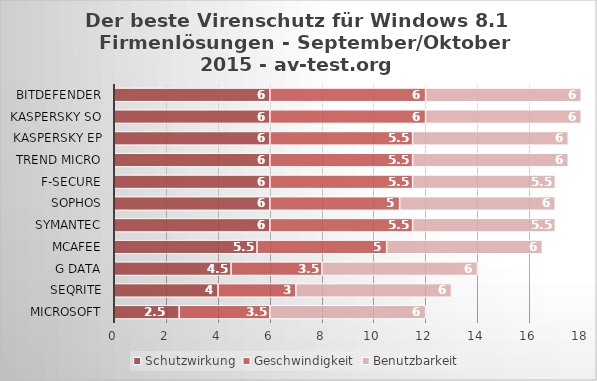
| Category | Schutzwirkung | Geschwindigkeit | Benutzbarkeit |
|---|---|---|---|
| Microsoft | 2.5 | 3.5 | 6 |
| Seqrite | 4 | 3 | 6 |
| G Data | 4.5 | 3.5 | 6 |
| McAfee | 5.5 | 5 | 6 |
| Symantec | 6 | 5.5 | 5.5 |
| Sophos | 6 | 5 | 6 |
| F-Secure | 6 | 5.5 | 5.5 |
| Trend Micro | 6 | 5.5 | 6 |
| Kaspersky EP | 6 | 5.5 | 6 |
| Kaspersky SO | 6 | 6 | 6 |
| Bitdefender | 6 | 6 | 6 |